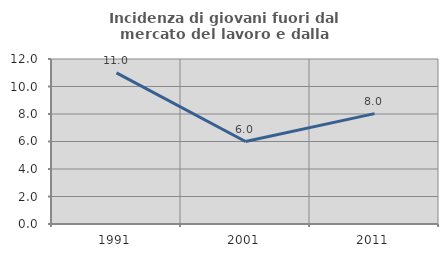
| Category | Incidenza di giovani fuori dal mercato del lavoro e dalla formazione  |
|---|---|
| 1991.0 | 10.989 |
| 2001.0 | 5.997 |
| 2011.0 | 8.029 |